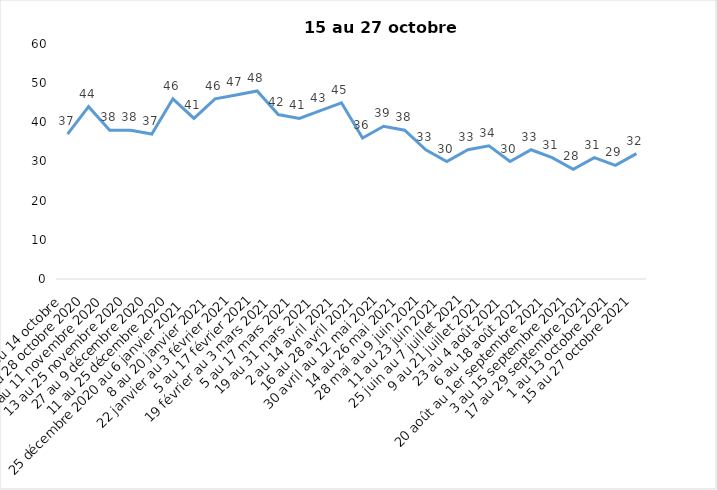
| Category | Toujours aux trois mesures |
|---|---|
| 2 au 14 octobre  | 37 |
| 16 au 28 octobre 2020 | 44 |
| 30 octobre au 11 novembre 2020 | 38 |
| 13 au 25 novembre 2020 | 38 |
| 27 au 9 décembre 2020 | 37 |
| 11 au 25 décembre 2020 | 46 |
| 25 décembre 2020 au 6 janvier 2021 | 41 |
| 8 au 20 janvier 2021 | 46 |
| 22 janvier au 3 février 2021 | 47 |
| 5 au 17 février 2021 | 48 |
| 19 février au 3 mars 2021 | 42 |
| 5 au 17 mars 2021 | 41 |
| 19 au 31 mars 2021 | 43 |
| 2 au 14 avril 2021 | 45 |
| 16 au 28 avril 2021 | 36 |
| 30 avril au 12 mai 2021 | 39 |
| 14 au 26 mai 2021 | 38 |
| 28 mai au 9 juin 2021 | 33 |
| 11 au 23 juin 2021 | 30 |
| 25 juin au 7 juillet 2021 | 33 |
| 9 au 21 juillet 2021 | 34 |
| 23 au 4 août 2021 | 30 |
| 6 au 18 août 2021 | 33 |
| 20 août au 1er septembre 2021 | 31 |
| 3 au 15 septembre 2021 | 28 |
| 17 au 29 septembre 2021 | 31 |
| 1 au 13 octobre 2021 | 29 |
| 15 au 27 octobre 2021 | 32 |